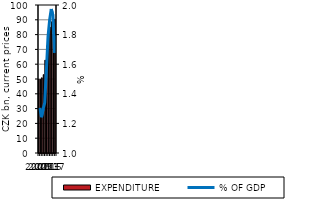
| Category | EXPENDITURE |
|---|---|
| 2007.0 | 50.009 |
| 2008.0 | 49.872 |
| 2009.0 | 50.875 |
| 2010.0 | 52.974 |
| 2011.0 | 62.753 |
| 2012.0 | 72.36 |
| 2013.0 | 77.853 |
| 2014.0 | 85.104 |
| 2015.0 | 88.663 |
| 2016.0 | 80.109 |
| 2017.0 | 90.377 |